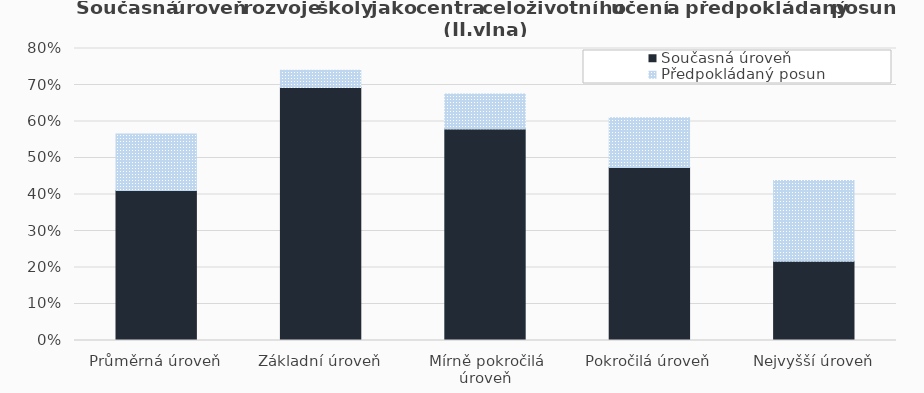
| Category | Současná úroveň | Předpokládaný posun |
|---|---|---|
| Průměrná úroveň | 0.411 | 0.155 |
| Základní úroveň | 0.693 | 0.047 |
| Mírně pokročilá úroveň | 0.579 | 0.096 |
| Pokročilá úroveň | 0.474 | 0.136 |
| Nejvyšší úroveň | 0.217 | 0.222 |